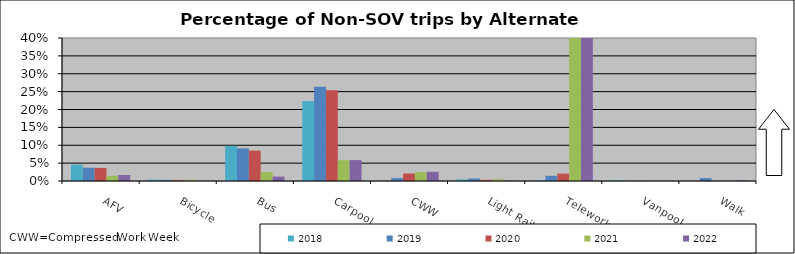
| Category | 2018 | 2019 | 2020 | 2021 | 2022 |
|---|---|---|---|---|---|
| AFV | 0.046 | 0.037 | 0.037 | 0.015 | 0.017 |
| Bicycle | 0.004 | 0.003 | 0.003 | 0.003 | 0 |
| Bus | 0.098 | 0.091 | 0.085 | 0.025 | 0.012 |
| Carpool | 0.224 | 0.264 | 0.254 | 0.058 | 0.058 |
| CWW | 0 | 0.008 | 0.021 | 0.025 | 0.026 |
| Light Rail | 0.004 | 0.007 | 0.003 | 0.004 | 0.001 |
| Telework | 0.003 | 0.015 | 0.021 | 0.619 | 0.643 |
| Vanpool | 0.002 | 0 | 0 | 0 | 0 |
| Walk | 0 | 0.008 | 0 | 0.001 | 0.002 |